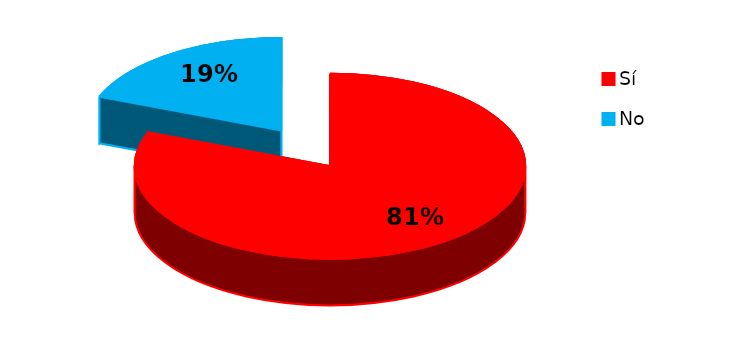
| Category | Series 0 |
|---|---|
| 0 | 17 |
| 1 | 4 |